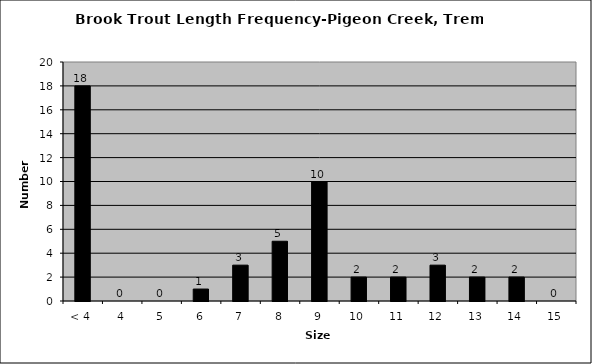
| Category | Series 0 |
|---|---|
| < 4 | 18 |
| 4 | 0 |
| 5 | 0 |
| 6 | 1 |
| 7 | 3 |
| 8 | 5 |
| 9 | 10 |
| 10 | 2 |
| 11 | 2 |
| 12 | 3 |
| 13 | 2 |
| 14 | 2 |
| 15 | 0 |